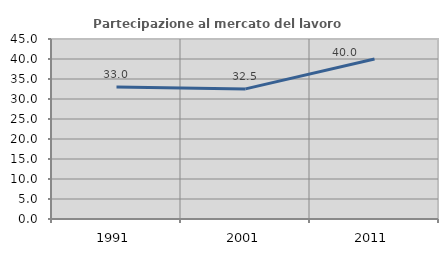
| Category | Partecipazione al mercato del lavoro  femminile |
|---|---|
| 1991.0 | 33.002 |
| 2001.0 | 32.53 |
| 2011.0 | 40 |